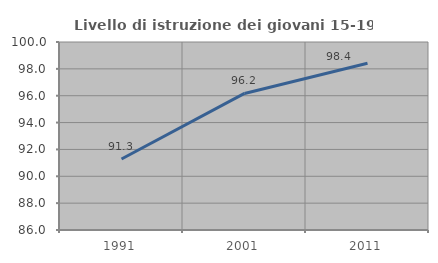
| Category | Livello di istruzione dei giovani 15-19 anni |
|---|---|
| 1991.0 | 91.29 |
| 2001.0 | 96.17 |
| 2011.0 | 98.413 |